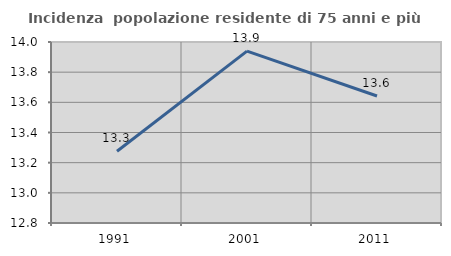
| Category | Incidenza  popolazione residente di 75 anni e più |
|---|---|
| 1991.0 | 13.276 |
| 2001.0 | 13.939 |
| 2011.0 | 13.642 |